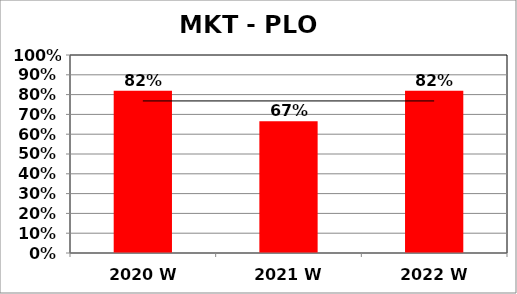
| Category | Series 0 |
|---|---|
| 2020 W | 0.82 |
| 2021 W | 0.665 |
| 2022 W | 0.82 |